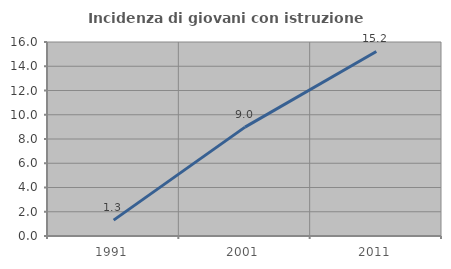
| Category | Incidenza di giovani con istruzione universitaria |
|---|---|
| 1991.0 | 1.31 |
| 2001.0 | 8.98 |
| 2011.0 | 15.217 |